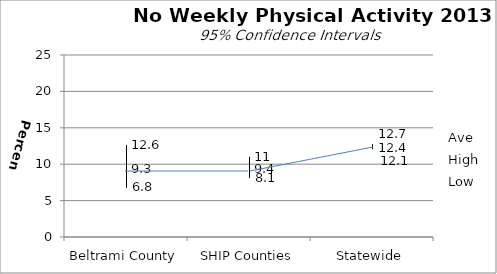
| Category | Ave | High | Low |
|---|---|---|---|
| Beltrami County | 9.3 | 12.6 | 6.8 |
| SHIP Counties | 9.4 | 11 | 8.1 |
| Statewide | 12.4 | 12.7 | 12.1 |